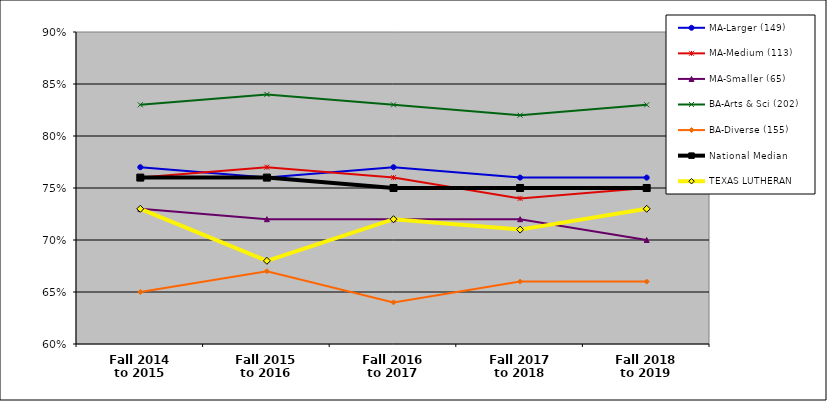
| Category | MA-Larger (149) | MA-Medium (113) | MA-Smaller (65) | BA-Arts & Sci (202) | BA-Diverse (155) | National Median | TEXAS LUTHERAN |
|---|---|---|---|---|---|---|---|
| Fall 2014
to 2015 | 0.77 | 0.76 | 0.73 | 0.83 | 0.65 | 0.76 | 0.73 |
| Fall 2015
to 2016 | 0.76 | 0.77 | 0.72 | 0.84 | 0.67 | 0.76 | 0.68 |
| Fall 2016
to 2017 | 0.77 | 0.76 | 0.72 | 0.83 | 0.64 | 0.75 | 0.72 |
| Fall 2017
to 2018 | 0.76 | 0.74 | 0.72 | 0.82 | 0.66 | 0.75 | 0.71 |
| Fall 2018
to 2019 | 0.76 | 0.75 | 0.7 | 0.83 | 0.66 | 0.75 | 0.73 |